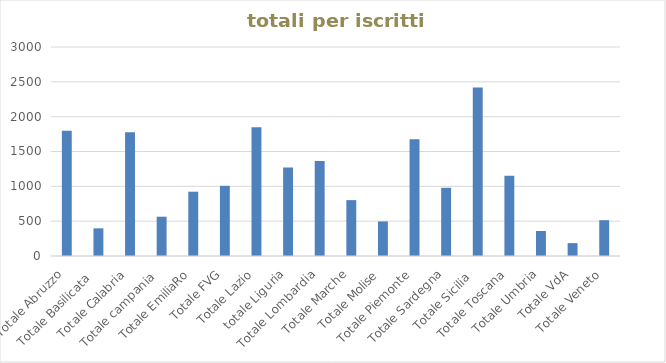
| Category | Series 0 |
|---|---|
| Totale Abruzzo | 1797 |
| Totale Basilicata  | 397 |
| Totale Calabria | 1776 |
| Totale campania  | 564 |
| Totale EmiliaRo | 923 |
| Totale FVG | 1007 |
| Totale Lazio | 1848 |
| totale Liguria | 1270 |
| Totale Lombardia | 1365 |
| Totale Marche | 802 |
| Totale Molise | 496 |
| Totale Piemonte | 1675 |
| Totale Sardegna | 979 |
| Totale Sicilia  | 2417 |
| Totale Toscana | 1152 |
| Totale Umbria | 359 |
| Totale VdA | 185 |
| Totale Veneto | 514 |